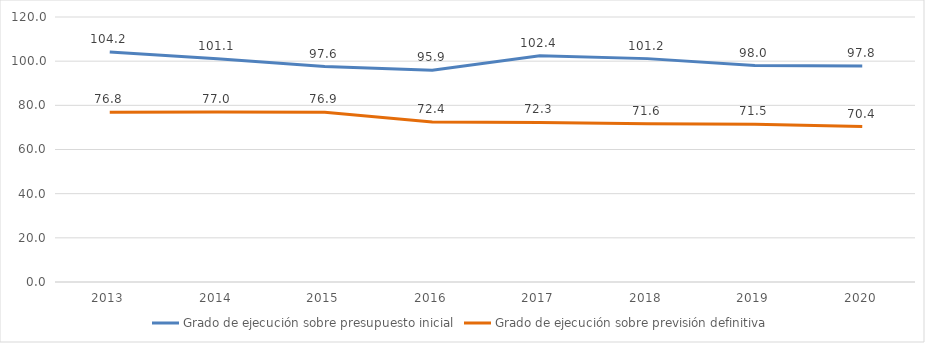
| Category | Grado de ejecución sobre presupuesto inicial | Grado de ejecución sobre previsión definitiva |
|---|---|---|
| 2013.0 | 104.199 | 76.817 |
| 2014.0 | 101.102 | 76.996 |
| 2015.0 | 97.554 | 76.909 |
| 2016.0 | 95.907 | 72.415 |
| 2017.0 | 102.448 | 72.279 |
| 2018.0 | 101.151 | 71.644 |
| 2019.0 | 98.015 | 71.472 |
| 2020.0 | 97.83 | 70.368 |